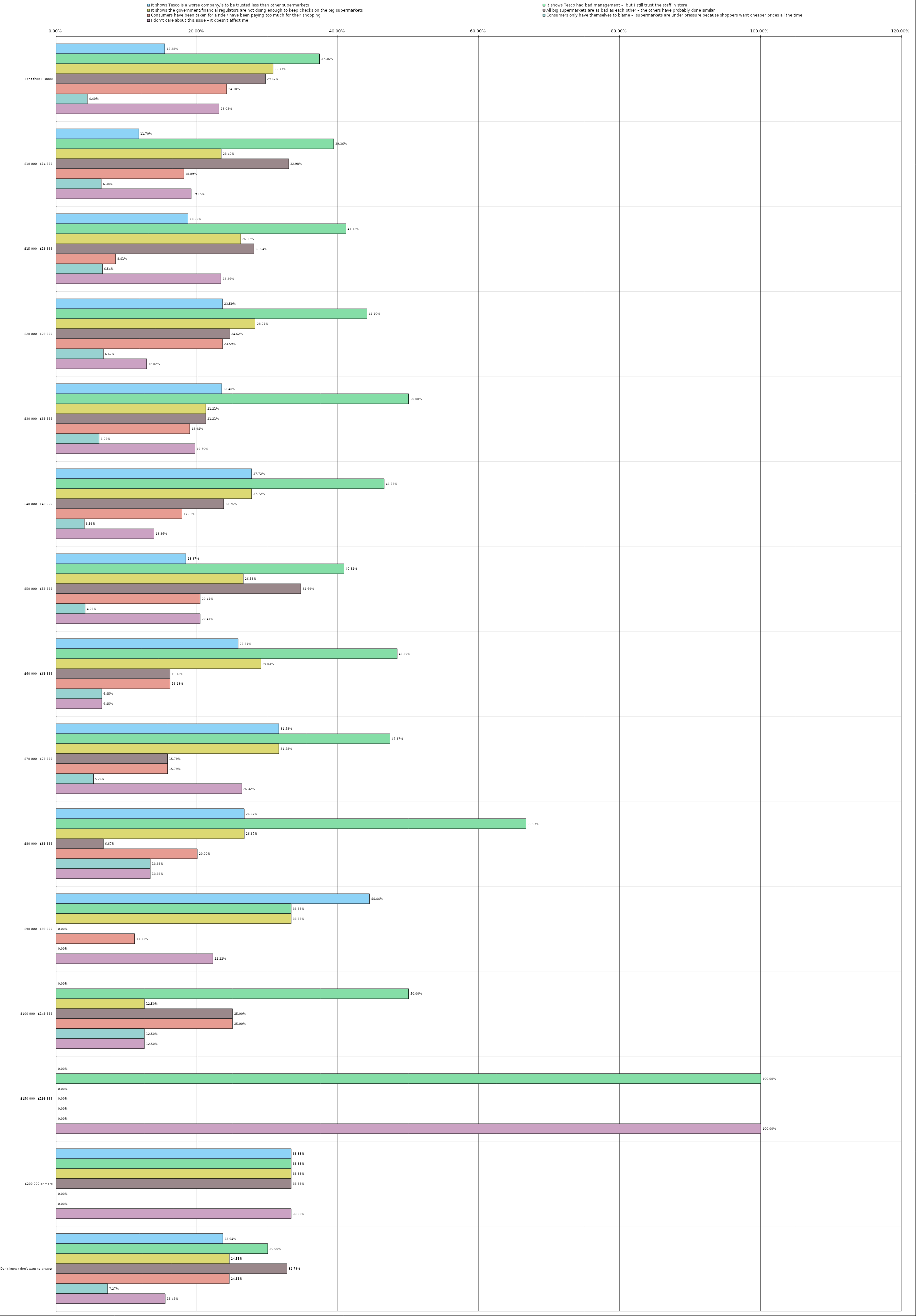
| Category | It shows Tesco is a worse company/is to be trusted less than other supermarkets | It shows Tesco had bad management –  but I still trust the staff in store | It shows the government/financial regulators are not doing enough to keep checks on the big supermarkets | All big supermarkets are as bad as each other – the others have probably done similar | Consumers have been taken for a ride / have been paying too much for their shopping | Consumers only have themselves to blame –  supermarkets are under pressure because shoppers want cheaper prices all the time | I don’t care about this issue – it doesn't affect me |
|---|---|---|---|---|---|---|---|
| 0 | 0.154 | 0.374 | 0.308 | 0.297 | 0.242 | 0.044 | 0.231 |
| 1 | 0.117 | 0.394 | 0.234 | 0.33 | 0.181 | 0.064 | 0.192 |
| 2 | 0.187 | 0.411 | 0.262 | 0.28 | 0.084 | 0.065 | 0.234 |
| 3 | 0.236 | 0.441 | 0.282 | 0.246 | 0.236 | 0.067 | 0.128 |
| 4 | 0.235 | 0.5 | 0.212 | 0.212 | 0.189 | 0.061 | 0.197 |
| 5 | 0.277 | 0.465 | 0.277 | 0.238 | 0.178 | 0.04 | 0.139 |
| 6 | 0.184 | 0.408 | 0.265 | 0.347 | 0.204 | 0.041 | 0.204 |
| 7 | 0.258 | 0.484 | 0.29 | 0.161 | 0.161 | 0.064 | 0.064 |
| 8 | 0.316 | 0.474 | 0.316 | 0.158 | 0.158 | 0.053 | 0.263 |
| 9 | 0.267 | 0.667 | 0.267 | 0.067 | 0.2 | 0.133 | 0.133 |
| 10 | 0.444 | 0.333 | 0.333 | 0 | 0.111 | 0 | 0.222 |
| 11 | 0 | 0.5 | 0.125 | 0.25 | 0.25 | 0.125 | 0.125 |
| 12 | 0 | 1 | 0 | 0 | 0 | 0 | 1 |
| 13 | 0.333 | 0.333 | 0.333 | 0.333 | 0 | 0 | 0.333 |
| 14 | 0.236 | 0.3 | 0.246 | 0.327 | 0.246 | 0.073 | 0.154 |